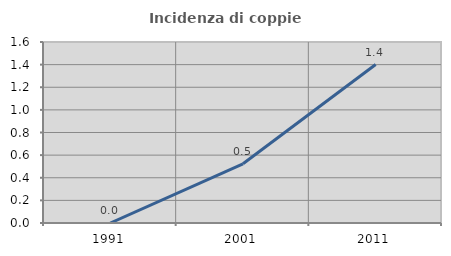
| Category | Incidenza di coppie miste |
|---|---|
| 1991.0 | 0 |
| 2001.0 | 0.524 |
| 2011.0 | 1.401 |